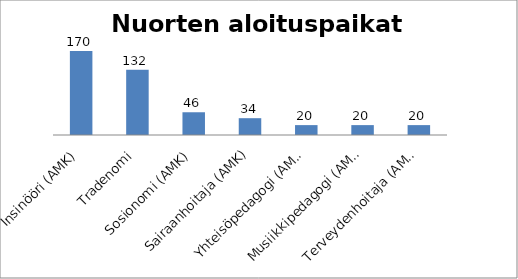
| Category | Series 0 |
|---|---|
| Insinööri (AMK) | 170 |
| Tradenomi | 132 |
| Sosionomi (AMK) | 46 |
| Sairaanhoitaja (AMK) | 34 |
| Yhteisöpedagogi (AMK) | 20 |
| Musiikkipedagogi (AMK) | 20 |
| Terveydenhoitaja (AMK) | 20 |